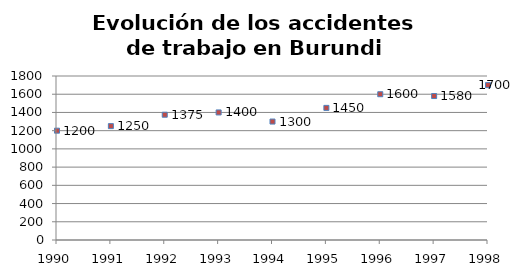
| Category | Nº Accid. |
|---|---|
| 1990.0 | 1200 |
| 1991.0 | 1250 |
| 1992.0 | 1375 |
| 1993.0 | 1400 |
| 1994.0 | 1300 |
| 1995.0 | 1450 |
| 1996.0 | 1600 |
| 1997.0 | 1580 |
| 1998.0 | 1700 |